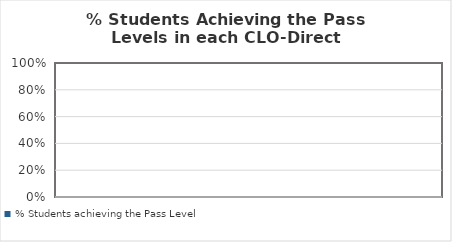
| Category | % Students achieving the Pass Level |
|---|---|
| 0 | 0 |
| 1 | 0 |
| 2 | 0 |
| 3 | 0 |
| 4 | 0 |
| 5 | 0 |
| 6 | 0 |
| 7 | 0 |
| 8 | 0 |
| 9 | 0 |
| 10 | 0 |